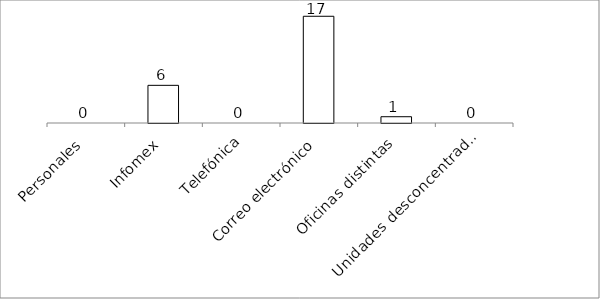
| Category | Series 0 |
|---|---|
| Personales | 0 |
| Infomex | 6 |
| Telefónica | 0 |
| Correo electrónico | 17 |
| Oficinas distintas | 1 |
| Unidades desconcentradas | 0 |